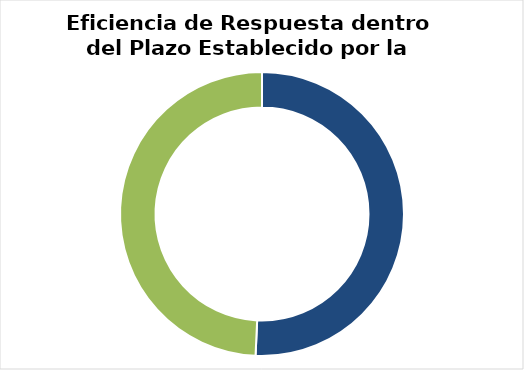
| Category | Series 0 |
|---|---|
| 0 | 35 |
| 1 | 0 |
| 2 | 34 |